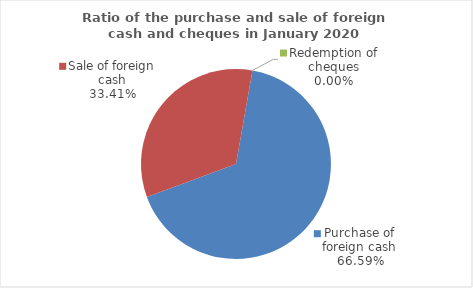
| Category | Series 0 |
|---|---|
| Purchase of foreign cash | 66.589 |
| Sale of foreign cash | 33.411 |
| Redemption of cheques | 0 |